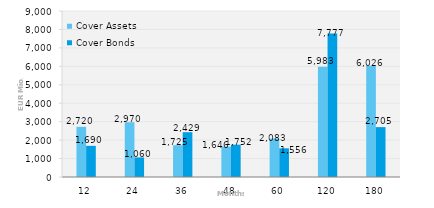
| Category | Cover Assets | Cover Bonds |
|---|---|---|
| 12.0 | 2720.293 | 1689.588 |
| 24.0 | 2970.188 | 1059.889 |
| 36.0 | 1724.913 | 2428.631 |
| 48.0 | 1646.333 | 1751.969 |
| 60.0 | 2082.527 | 1556.247 |
| 120.0 | 5983.084 | 7776.604 |
| 180.0 | 6026.227 | 2704.66 |